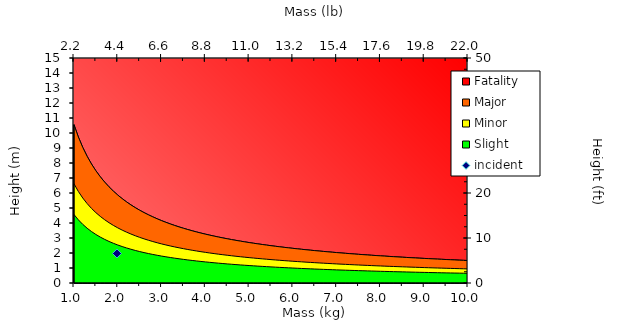
| Category | Fatality | Major | Minor | Slight |
|---|---|---|---|---|
| 1.0 | 10.551 | 10.551 | 6.613 | 4.563 |
| 1.1 | 9.732 | 9.732 | 6.1 | 4.209 |
| 1.2 | 9.04 | 9.04 | 5.666 | 3.909 |
| 1.3 | 8.447 | 8.447 | 5.295 | 3.652 |
| 1.4000000000000001 | 7.933 | 7.933 | 4.972 | 3.43 |
| 1.5000000000000002 | 7.482 | 7.482 | 4.69 | 3.234 |
| 1.6000000000000003 | 7.084 | 7.084 | 4.441 | 3.062 |
| 1.7000000000000004 | 6.729 | 6.729 | 4.218 | 2.908 |
| 1.8000000000000005 | 6.411 | 6.411 | 4.019 | 2.771 |
| 1.9000000000000006 | 6.124 | 6.124 | 3.839 | 2.646 |
| 2.000000000000001 | 5.863 | 5.863 | 3.676 | 2.534 |
| 2.1000000000000005 | 5.626 | 5.626 | 3.527 | 2.431 |
| 2.200000000000001 | 5.408 | 5.408 | 3.391 | 2.337 |
| 2.3000000000000007 | 5.208 | 5.208 | 3.265 | 2.25 |
| 2.4000000000000012 | 5.024 | 5.024 | 3.15 | 2.17 |
| 2.500000000000001 | 4.853 | 4.853 | 3.043 | 2.096 |
| 2.6000000000000014 | 4.694 | 4.694 | 2.943 | 2.028 |
| 2.700000000000001 | 4.546 | 4.546 | 2.851 | 1.964 |
| 2.8000000000000016 | 4.408 | 4.408 | 2.764 | 1.904 |
| 2.9000000000000012 | 4.279 | 4.279 | 2.683 | 1.848 |
| 3.0000000000000018 | 4.158 | 4.158 | 2.607 | 1.796 |
| 3.1000000000000014 | 4.044 | 4.044 | 2.536 | 1.746 |
| 3.200000000000002 | 3.937 | 3.937 | 2.468 | 1.7 |
| 3.3000000000000016 | 3.835 | 3.835 | 2.405 | 1.656 |
| 3.400000000000002 | 3.739 | 3.739 | 2.345 | 1.615 |
| 3.5000000000000018 | 3.649 | 3.649 | 2.288 | 1.576 |
| 3.6000000000000023 | 3.563 | 3.563 | 2.234 | 1.538 |
| 3.700000000000002 | 3.481 | 3.481 | 2.183 | 1.503 |
| 3.8000000000000025 | 3.403 | 3.403 | 2.134 | 1.469 |
| 3.900000000000002 | 3.329 | 3.329 | 2.087 | 1.437 |
| 4.000000000000003 | 3.258 | 3.258 | 2.043 | 1.407 |
| 4.100000000000002 | 3.191 | 3.191 | 2.001 | 1.377 |
| 4.200000000000003 | 3.126 | 3.126 | 1.96 | 1.35 |
| 4.3000000000000025 | 3.065 | 3.065 | 1.922 | 1.323 |
| 4.400000000000003 | 3.005 | 3.005 | 1.885 | 1.297 |
| 4.500000000000003 | 2.949 | 2.949 | 1.849 | 1.273 |
| 4.600000000000003 | 2.894 | 2.894 | 1.815 | 1.249 |
| 4.700000000000003 | 2.842 | 2.842 | 1.782 | 1.227 |
| 4.800000000000003 | 2.792 | 2.792 | 1.751 | 1.205 |
| 4.900000000000003 | 2.743 | 2.743 | 1.72 | 1.184 |
| 5.0000000000000036 | 2.697 | 2.697 | 1.691 | 1.164 |
| 5.100000000000003 | 2.652 | 2.652 | 1.663 | 1.145 |
| 5.200000000000004 | 2.609 | 2.609 | 1.636 | 1.126 |
| 5.300000000000003 | 2.567 | 2.567 | 1.61 | 1.108 |
| 5.400000000000004 | 2.526 | 2.526 | 1.584 | 1.09 |
| 5.5000000000000036 | 2.487 | 2.487 | 1.56 | 1.073 |
| 5.600000000000004 | 2.45 | 2.45 | 1.536 | 1.057 |
| 5.700000000000004 | 2.413 | 2.413 | 1.514 | 1.041 |
| 5.800000000000004 | 2.378 | 2.378 | 1.491 | 1.026 |
| 5.900000000000004 | 2.344 | 2.344 | 1.47 | 1.011 |
| 6.000000000000004 | 2.311 | 2.311 | 1.449 | 0.997 |
| 6.100000000000004 | 2.278 | 2.278 | 1.429 | 0.983 |
| 6.200000000000005 | 2.247 | 2.247 | 1.409 | 0.97 |
| 6.300000000000004 | 2.217 | 2.217 | 1.391 | 0.957 |
| 6.400000000000005 | 2.188 | 2.188 | 1.372 | 0.944 |
| 6.500000000000004 | 2.159 | 2.159 | 1.354 | 0.932 |
| 6.600000000000005 | 2.131 | 2.131 | 1.337 | 0.92 |
| 6.700000000000005 | 2.104 | 2.104 | 1.32 | 0.908 |
| 6.800000000000005 | 2.078 | 2.078 | 1.303 | 0.897 |
| 6.900000000000005 | 2.052 | 2.052 | 1.287 | 0.885 |
| 7.000000000000005 | 2.028 | 2.028 | 1.272 | 0.875 |
| 7.100000000000005 | 2.003 | 2.003 | 1.257 | 0.864 |
| 7.2000000000000055 | 1.98 | 1.98 | 1.242 | 0.854 |
| 7.300000000000005 | 1.957 | 1.957 | 1.227 | 0.844 |
| 7.400000000000006 | 1.934 | 1.934 | 1.213 | 0.834 |
| 7.500000000000005 | 1.912 | 1.912 | 1.2 | 0.825 |
| 7.600000000000006 | 1.891 | 1.891 | 1.186 | 0.816 |
| 7.7000000000000055 | 1.87 | 1.87 | 1.173 | 0.807 |
| 7.800000000000006 | 1.85 | 1.85 | 1.16 | 0.798 |
| 7.900000000000006 | 1.83 | 1.83 | 1.148 | 0.789 |
| 8.000000000000005 | 1.811 | 1.811 | 1.136 | 0.781 |
| 8.100000000000007 | 1.792 | 1.792 | 1.124 | 0.773 |
| 8.200000000000006 | 1.773 | 1.773 | 1.112 | 0.765 |
| 8.300000000000006 | 1.755 | 1.755 | 1.101 | 0.757 |
| 8.400000000000006 | 1.737 | 1.737 | 1.09 | 0.749 |
| 8.500000000000007 | 1.72 | 1.72 | 1.079 | 0.742 |
| 8.600000000000007 | 1.703 | 1.703 | 1.068 | 0.734 |
| 8.700000000000006 | 1.686 | 1.686 | 1.058 | 0.727 |
| 8.800000000000006 | 1.67 | 1.67 | 1.048 | 0.72 |
| 8.900000000000007 | 1.654 | 1.654 | 1.038 | 0.713 |
| 9.000000000000007 | 1.639 | 1.639 | 1.028 | 0.707 |
| 9.100000000000007 | 1.623 | 1.623 | 1.018 | 0.7 |
| 9.200000000000006 | 1.608 | 1.608 | 1.009 | 0.694 |
| 9.300000000000008 | 1.594 | 1.594 | 1 | 0.687 |
| 9.400000000000007 | 1.579 | 1.579 | 0.991 | 0.681 |
| 9.500000000000007 | 1.565 | 1.565 | 0.982 | 0.675 |
| 9.600000000000007 | 1.551 | 1.551 | 0.973 | 0.669 |
| 9.700000000000008 | 1.538 | 1.538 | 0.965 | 0.663 |
| 9.800000000000008 | 1.524 | 1.524 | 0.956 | 0.657 |
| 9.900000000000007 | 1.511 | 1.511 | 0.948 | 0.652 |
| 10.000000000000007 | 1.499 | 1.499 | 0.94 | 0.646 |